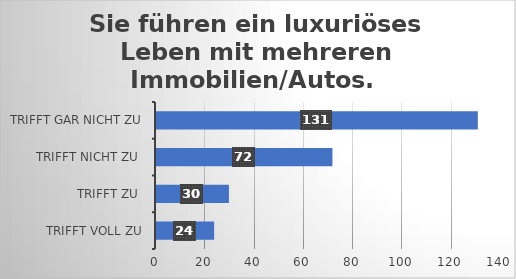
| Category | Sie führen ein luxuriöses Leben mit mehreren Immobilien/Autos.  |
|---|---|
| trifft voll zu | 24 |
| trifft zu  | 30 |
| trifft nicht zu  | 72 |
| trifft gar nicht zu | 131 |